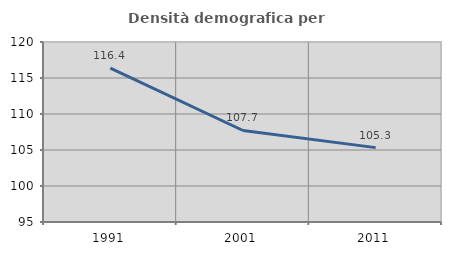
| Category | Densità demografica |
|---|---|
| 1991.0 | 116.378 |
| 2001.0 | 107.71 |
| 2011.0 | 105.33 |